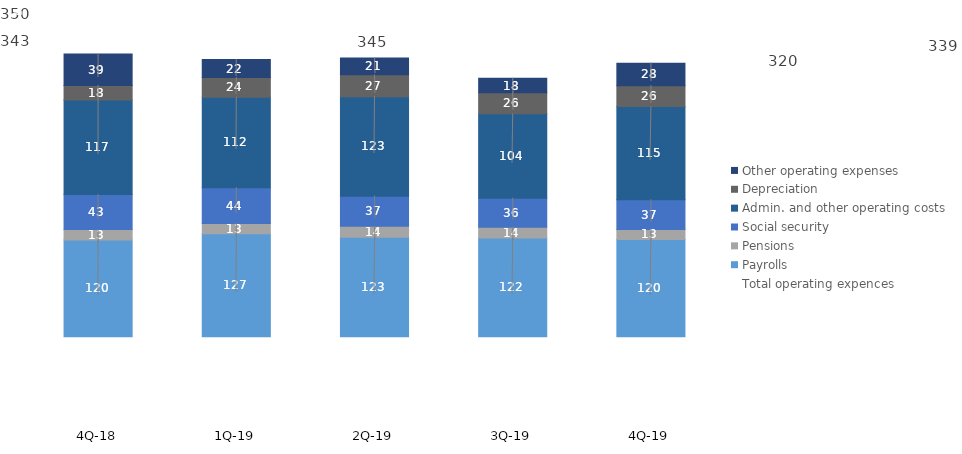
| Category | Payrolls | Pensions | Social security | Admin. and other operating costs | Depreciation | Other operating expenses |
|---|---|---|---|---|---|---|
| 4Q-19 | 120.223 | 12.54 | 36.799 | 115.196 | 25.974 | 27.802 |
| 3Q-19 | 122.031 | 13.58 | 35.843 | 104.32 | 26.181 | 17.805 |
| 2Q-19 | 123.15 | 13.54 | 37.28 | 122.97 | 27.2 | 20.83 |
| 1Q-19 | 127.289 | 12.805 | 44.276 | 112.059 | 24.33 | 22.21 |
| 4Q-18 | 119.563 | 13.071 | 43.33 | 117.052 | 17.876 | 38.942 |